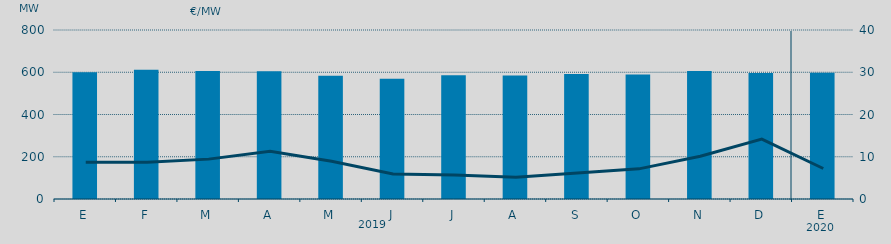
| Category | Energia (MWh) a subir |
|---|---|
| E | 600.235 |
| F | 612.121 |
| M | 605.978 |
| A | 604.29 |
| M | 583.379 |
| J | 569.496 |
| J | 585.727 |
| A | 584.609 |
| S | 591.64 |
| O | 589.349 |
| N | 605.422 |
| D | 596.999 |
| E | 597.488 |